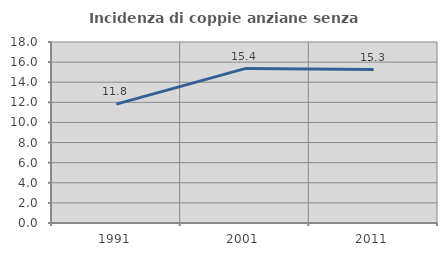
| Category | Incidenza di coppie anziane senza figli  |
|---|---|
| 1991.0 | 11.824 |
| 2001.0 | 15.356 |
| 2011.0 | 15.254 |